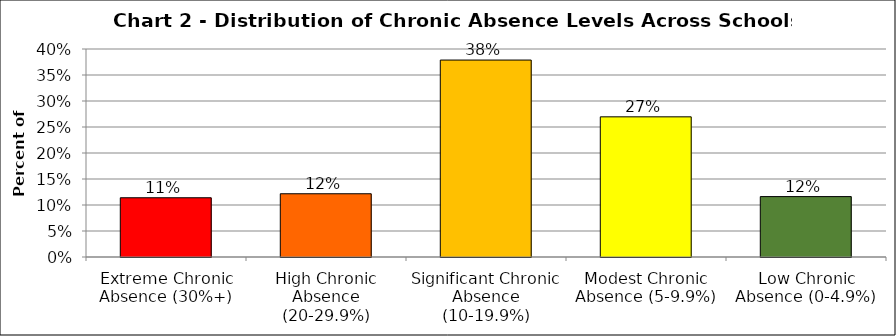
| Category | Series 1 |
|---|---|
| Extreme Chronic Absence (30%+) | 0.114 |
| High Chronic Absence (20-29.9%) | 0.122 |
| Significant Chronic Absence (10-19.9%) | 0.379 |
| Modest Chronic Absence (5-9.9%) | 0.27 |
| Low Chronic Absence (0-4.9%) | 0.116 |